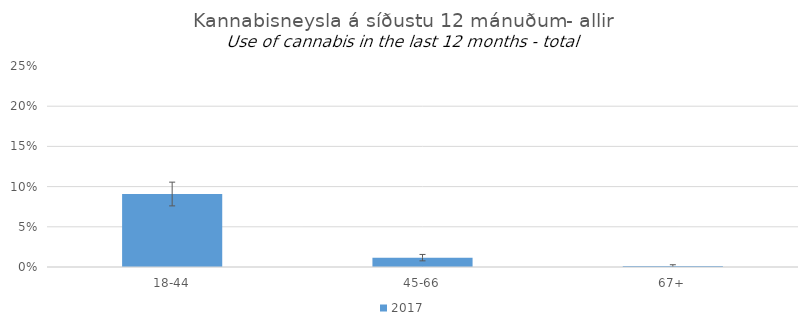
| Category | 2017 |
|---|---|
| 18-44 | 0.091 |
| 45-66 | 0.012 |
| 67+ | 0.001 |